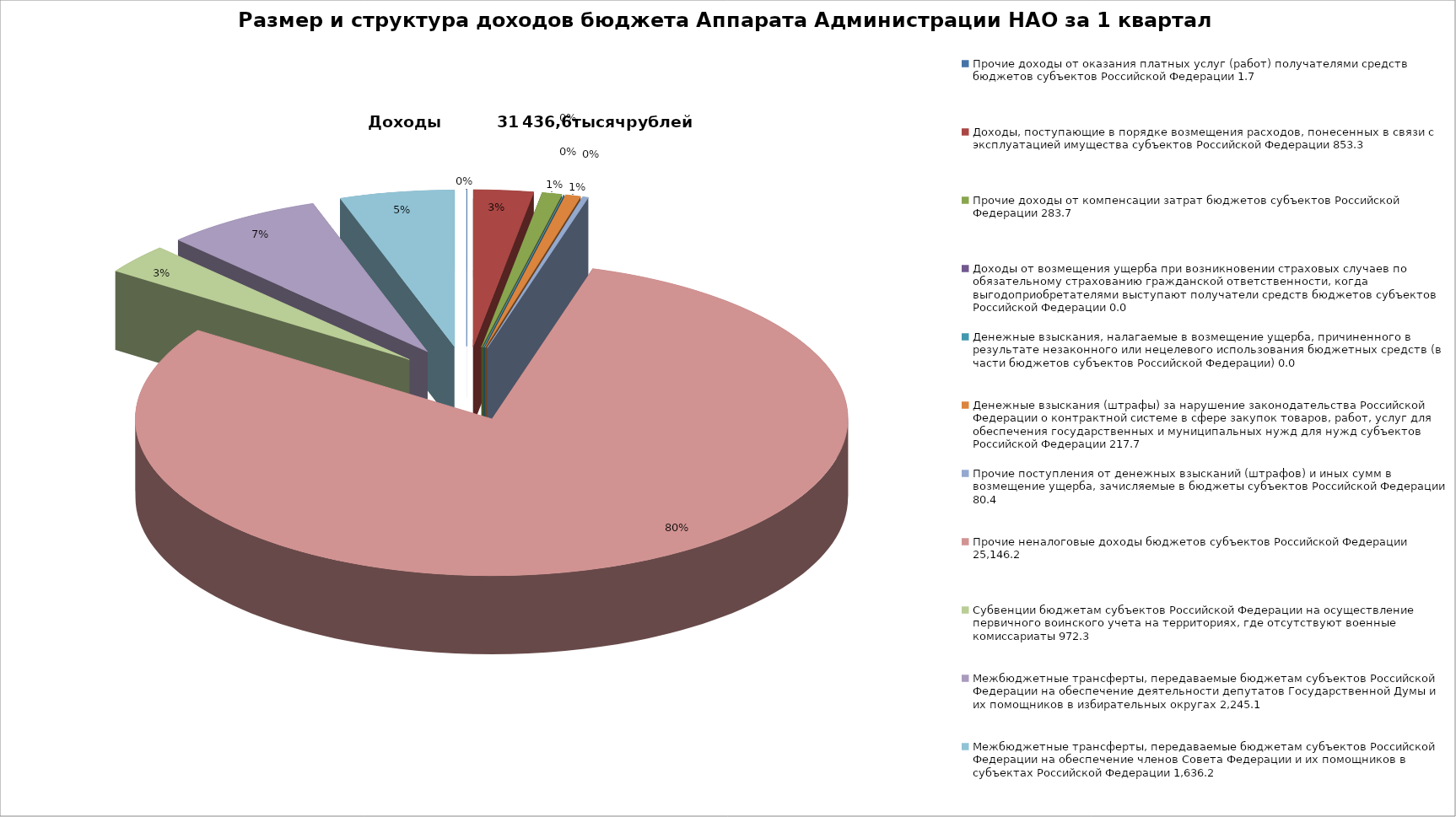
| Category | Размер и структура доходов бюджета Аппарата Администрации НАО за 1 квартал 2019 г. |
|---|---|
| 0 | 1.7 |
| 1 | 853.3 |
| 2 | 283.7 |
| 3 | 0 |
| 4 | 0 |
| 5 | 217.7 |
| 6 | 80.4 |
| 7 | 25146.2 |
| 8 | 972.3 |
| 9 | 2245.1 |
| 10 | 1636.2 |